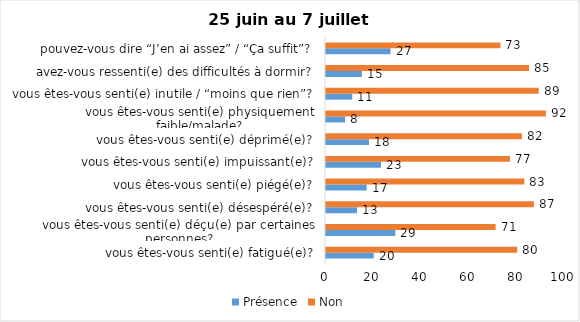
| Category | Présence | Non |
|---|---|---|
| vous êtes-vous senti(e) fatigué(e)? | 20 | 80 |
| vous êtes-vous senti(e) déçu(e) par certaines personnes? | 29 | 71 |
| vous êtes-vous senti(e) désespéré(e)? | 13 | 87 |
| vous êtes-vous senti(e) piégé(e)? | 17 | 83 |
| vous êtes-vous senti(e) impuissant(e)? | 23 | 77 |
| vous êtes-vous senti(e) déprimé(e)? | 18 | 82 |
| vous êtes-vous senti(e) physiquement faible/malade? | 8 | 92 |
| vous êtes-vous senti(e) inutile / “moins que rien”? | 11 | 89 |
| avez-vous ressenti(e) des difficultés à dormir? | 15 | 85 |
| pouvez-vous dire “J’en ai assez” / “Ça suffit”? | 27 | 73 |